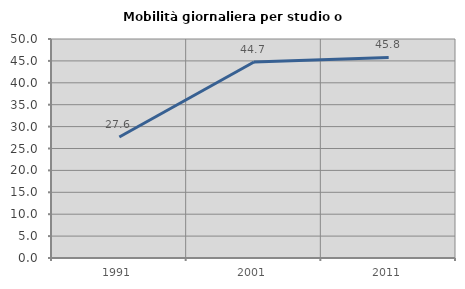
| Category | Mobilità giornaliera per studio o lavoro |
|---|---|
| 1991.0 | 27.636 |
| 2001.0 | 44.748 |
| 2011.0 | 45.796 |